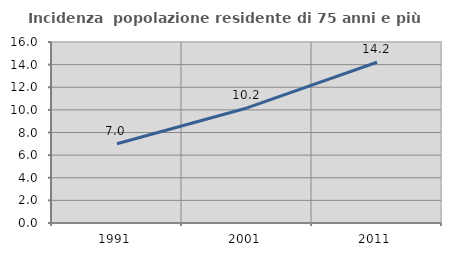
| Category | Incidenza  popolazione residente di 75 anni e più |
|---|---|
| 1991.0 | 7.001 |
| 2001.0 | 10.171 |
| 2011.0 | 14.213 |